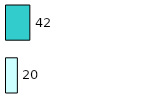
| Category | Series 0 | Series 1 |
|---|---|---|
| 0 | 20 | 42 |